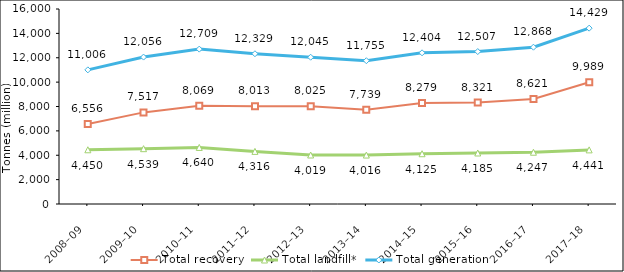
| Category | Total recovery | Total landfill* | Total generation |
|---|---|---|---|
| 2008–09 | 6555728 | 4449929 | 11005657 |
| 2009–10 | 7517000 | 4539072 | 12056072 |
| 2010–11 | 8068601 | 4640138 | 12708739 |
| 2011–12 | 8013047 | 4315938 | 12328985 |
| 2012–13 | 8025179 | 4019453.19 | 12044632.19 |
| 2013–14 | 7738953 | 4016282.65 | 11755235.65 |
| 2014–15 | 8278719.84 | 4125479 | 12404198.84 |
| 2015–16 | 8321148.57 | 4185372.2 | 12506520.77 |
| 2016–17 | 8620706.13 | 4247097 | 12867803.13 |
| 2017–18 | 9988689.42 | 4440777 | 14429466.42 |